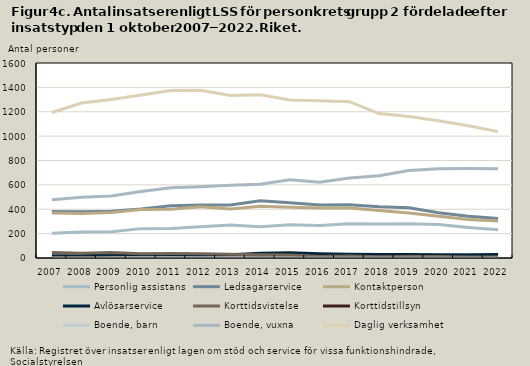
| Category | Personlig assistans | Ledsagarservice | Kontaktperson | Avlösarservice | Korttidsvistelse | Korttidstillsyn | Boende, barn | Boende, vuxna | Daglig verksamhet |
|---|---|---|---|---|---|---|---|---|---|
| 2007.0 | 203 | 382 | 369 | 18 | 45 | 3 | 0 | 478 | 1194 |
| 2008.0 | 213 | 380 | 365 | 21 | 39 | 6 | 1 | 499 | 1271 |
| 2009.0 | 215 | 384 | 374 | 31 | 45 | 2 | 0 | 509 | 1300 |
| 2010.0 | 241 | 403 | 397 | 27 | 34 | 0 | 0 | 546 | 1338 |
| 2011.0 | 242 | 429 | 401 | 26 | 36 | 0 | 0 | 577 | 1375 |
| 2012.0 | 256 | 434 | 420 | 25 | 35 | 0 | 1 | 585 | 1377 |
| 2013.0 | 270 | 435 | 403 | 26 | 30 | 0 | 0 | 597 | 1334 |
| 2014.0 | 256 | 470 | 424 | 39 | 27 | 2 | 0 | 606 | 1339 |
| 2015.0 | 272 | 453 | 417 | 43 | 25 | 0 | 0 | 642 | 1296 |
| 2016.0 | 267 | 435 | 411 | 35 | 13 | 0 | 0 | 622 | 1290 |
| 2017.0 | 282 | 436 | 410 | 31 | 16 | 0 | 1 | 656 | 1283 |
| 2018.0 | 279 | 420 | 389 | 29 | 10 | 0 | 1 | 675 | 1185 |
| 2019.0 | 281 | 413 | 370 | 28 | 13 | 0 | 1 | 718 | 1161 |
| 2020.0 | 274 | 372 | 342 | 27 | 13 | 0 | 1 | 732 | 1127 |
| 2021.0 | 251 | 343 | 315 | 27 | 9 | 2 | 0 | 735 | 1085 |
| 2022.0 | 232 | 325 | 304 | 28 | 8 | 1 | 1 | 733 | 1037 |